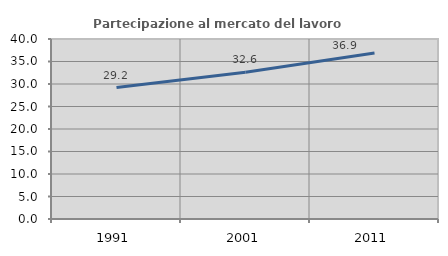
| Category | Partecipazione al mercato del lavoro  femminile |
|---|---|
| 1991.0 | 29.217 |
| 2001.0 | 32.591 |
| 2011.0 | 36.906 |